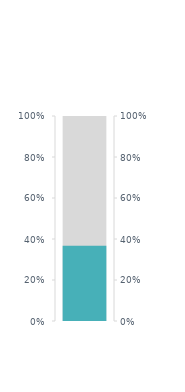
| Category | Berat Untuk Dikurangi |
|---|---|
| 0 | 30 |